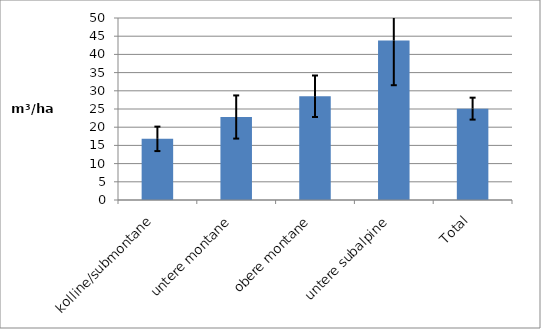
| Category | Series 0 |
|---|---|
| kolline/submontane | 16.8 |
| untere montane | 22.8 |
| obere montane | 28.5 |
| untere subalpine | 43.8 |
| Total | 25.1 |